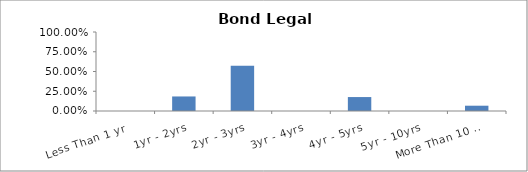
| Category | Series 0 |
|---|---|
| Less Than 1 yr | 0 |
| 1yr - 2yrs | 0.184 |
| 2yr - 3yrs | 0.572 |
| 3yr - 4yrs | 0 |
| 4yr - 5yrs | 0.177 |
| 5yr - 10yrs | 0 |
| More Than 10 yrs | 0.067 |